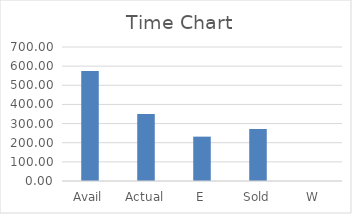
| Category | Series 0 |
|---|---|
| Avail | 574.9 |
| Actual | 349.78 |
| E | 231.73 |
| Sold | 271.1 |
| W | 0 |